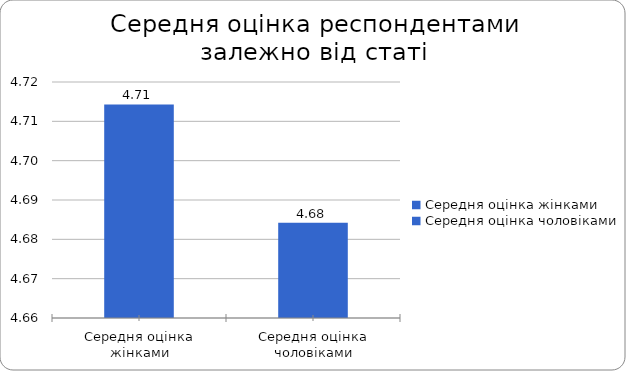
| Category | Series 0 |
|---|---|
| Середня оцінка жінками | 4.714 |
| Середня оцінка чоловіками | 4.684 |